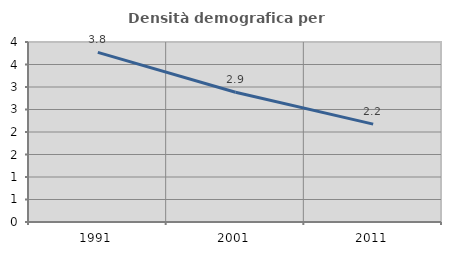
| Category | Densità demografica |
|---|---|
| 1991.0 | 3.77 |
| 2001.0 | 2.884 |
| 2011.0 | 2.175 |